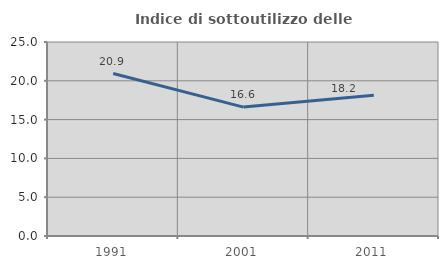
| Category | Indice di sottoutilizzo delle abitazioni  |
|---|---|
| 1991.0 | 20.939 |
| 2001.0 | 16.609 |
| 2011.0 | 18.151 |